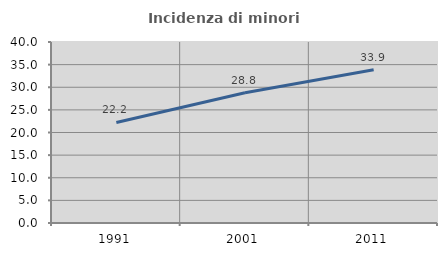
| Category | Incidenza di minori stranieri |
|---|---|
| 1991.0 | 22.222 |
| 2001.0 | 28.767 |
| 2011.0 | 33.874 |